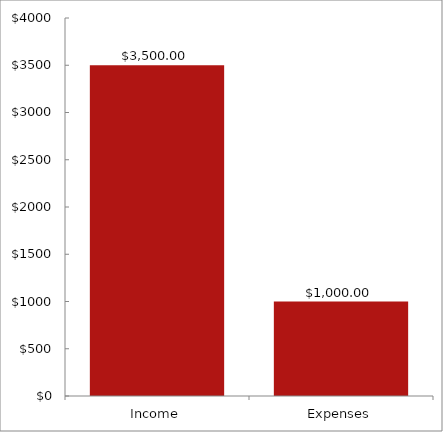
| Category | ChartData |
|---|---|
| 0 | 3500 |
| 1 | 1000 |